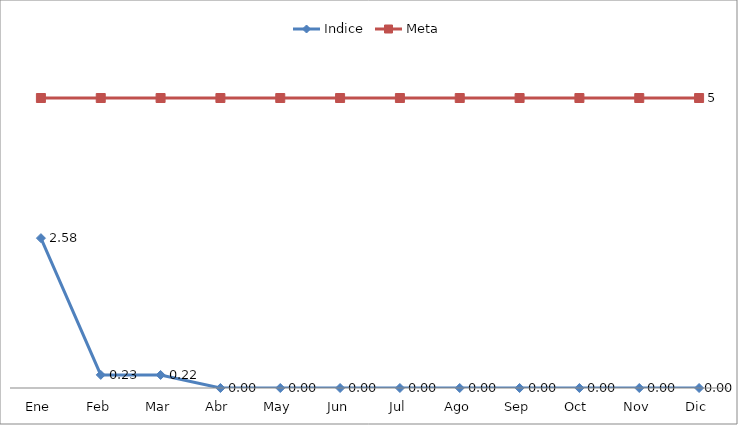
| Category | Indice | Meta |
|---|---|---|
| Ene | 2.584 | 5 |
| Feb | 0.226 | 5 |
| Mar | 0.225 | 5 |
| Abr | 0 | 5 |
| May | 0 | 5 |
| Jun | 0 | 5 |
| Jul | 0 | 5 |
| Ago | 0 | 5 |
| Sep | 0 | 5 |
| Oct | 0 | 5 |
| Nov | 0 | 5 |
| Dic | 0 | 5 |